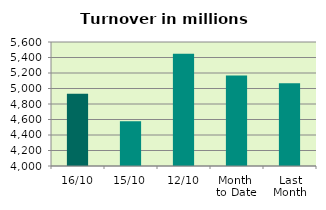
| Category | Series 0 |
|---|---|
| 16/10 | 4932.757 |
| 15/10 | 4578.604 |
| 12/10 | 5447.757 |
| Month 
to Date | 5168.579 |
| Last
Month | 5068.328 |